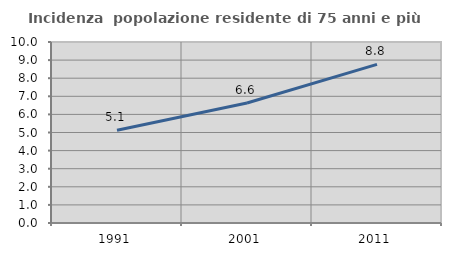
| Category | Incidenza  popolazione residente di 75 anni e più |
|---|---|
| 1991.0 | 5.128 |
| 2001.0 | 6.627 |
| 2011.0 | 8.763 |